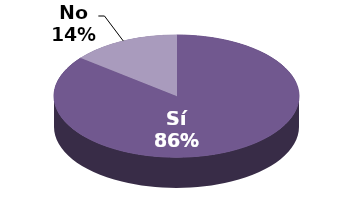
| Category | Series 1 |
|---|---|
| Sí | 12 |
| No | 2 |